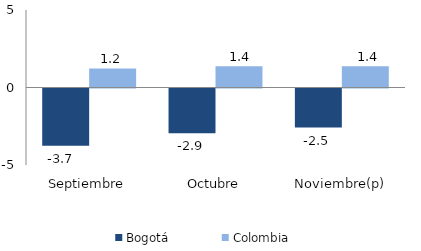
| Category | Bogotá | Colombia |
|---|---|---|
| Septiembre | -3.695 | 1.232 |
| Octubre | -2.882 | 1.363 |
| Noviembre(p) | -2.518 | 1.37 |